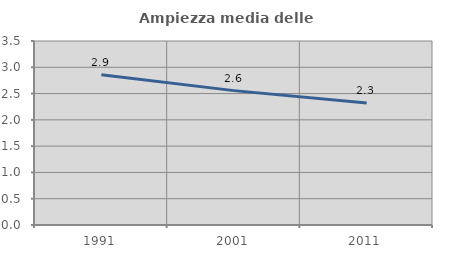
| Category | Ampiezza media delle famiglie |
|---|---|
| 1991.0 | 2.859 |
| 2001.0 | 2.556 |
| 2011.0 | 2.32 |